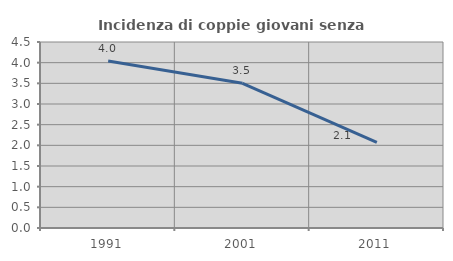
| Category | Incidenza di coppie giovani senza figli |
|---|---|
| 1991.0 | 4.038 |
| 2001.0 | 3.501 |
| 2011.0 | 2.072 |